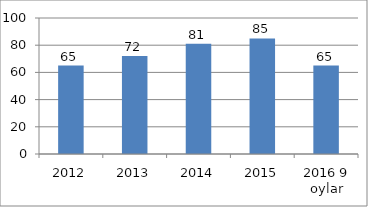
| Category | Series 0 |
|---|---|
| 2012 | 65 |
| 2013 | 72 |
| 2014 | 81 |
| 2015 | 85 |
| 2016 9 oylar | 65 |